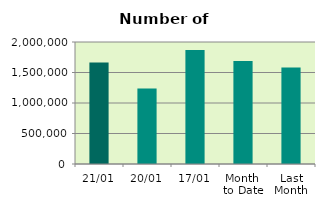
| Category | Series 0 |
|---|---|
| 21/01 | 1664292 |
| 20/01 | 1237468 |
| 17/01 | 1870450 |
| Month 
to Date | 1689574.143 |
| Last
Month | 1583843.3 |